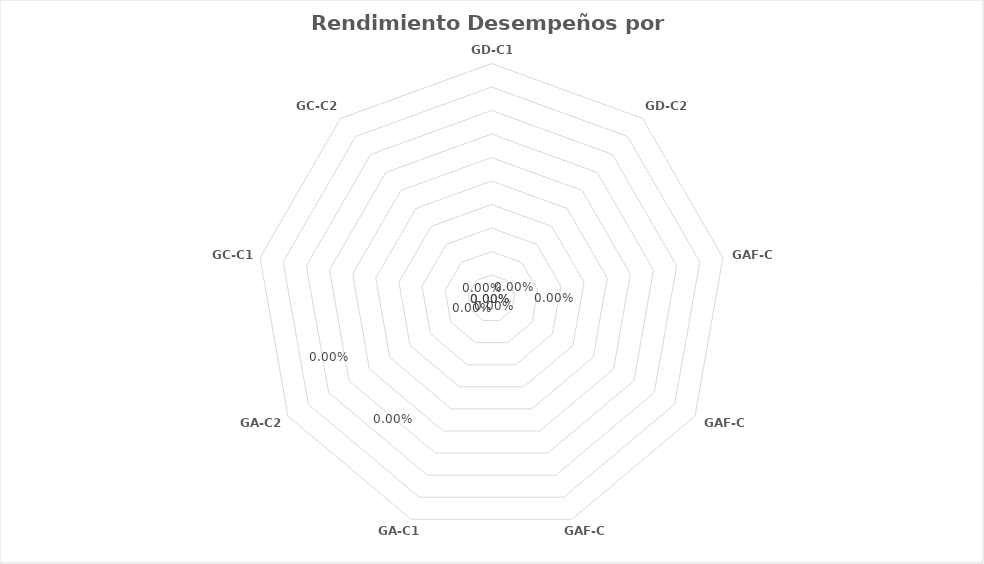
| Category | Series 0 |
|---|---|
| GD-C1 | 0 |
| GD-C2 | 0 |
| GAF-C1 | 0 |
| GAF-C2 | 0 |
| GAF-C3 | 0 |
| GA-C1 | 0 |
| GA-C2 | 0 |
| GC-C1 | 0 |
| GC-C2 | 0 |